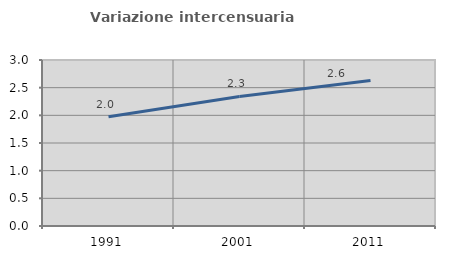
| Category | Variazione intercensuaria annua |
|---|---|
| 1991.0 | 1.976 |
| 2001.0 | 2.341 |
| 2011.0 | 2.629 |